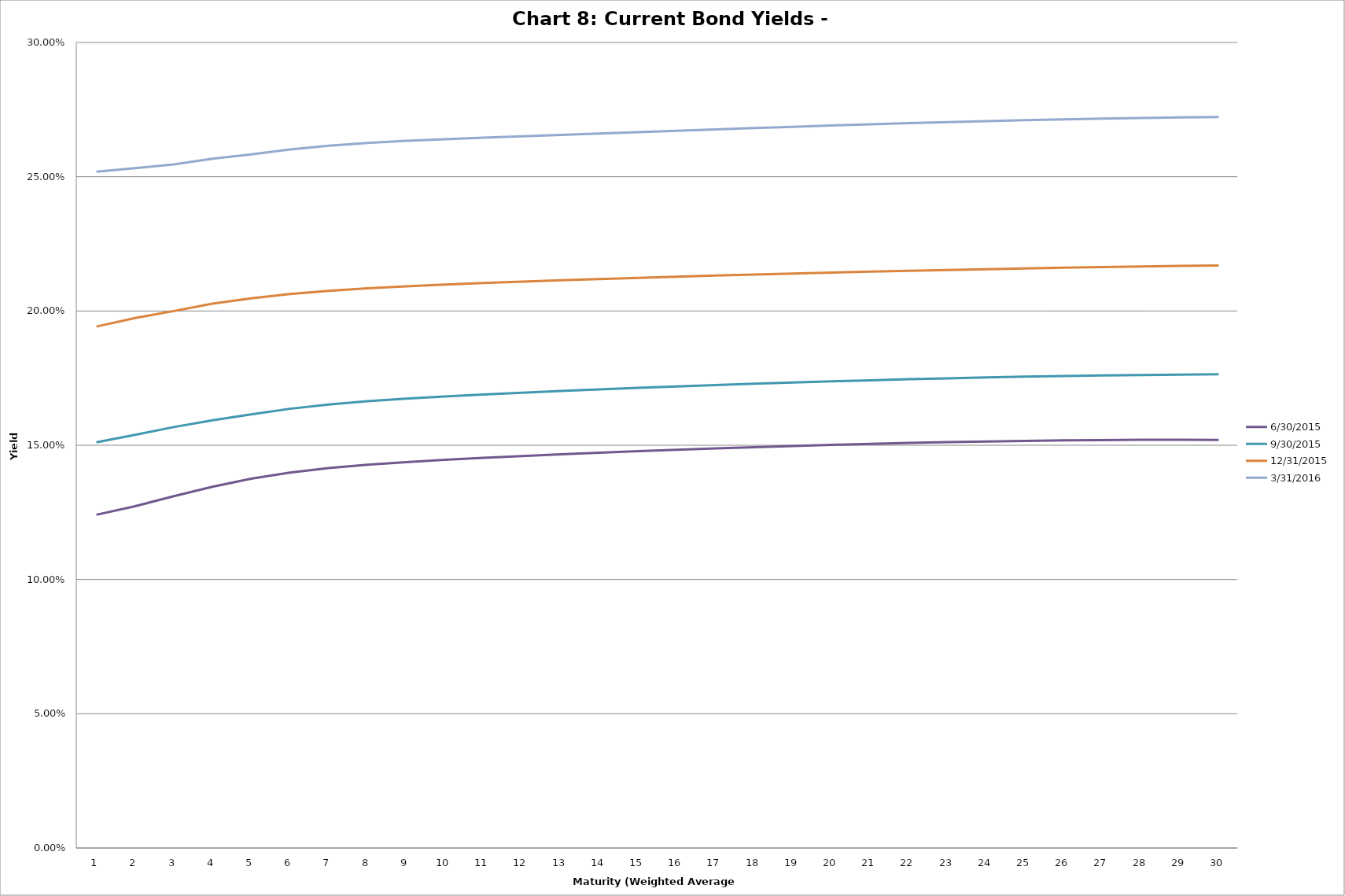
| Category | 6/30/2015 | 9/30/2015 | 12/31/2015 | 3/31/2016 |
|---|---|---|---|---|
| 0 | 0.124 | 0.151 | 0.194 | 0.252 |
| 1 | 0.127 | 0.154 | 0.197 | 0.253 |
| 2 | 0.131 | 0.157 | 0.2 | 0.255 |
| 3 | 0.135 | 0.159 | 0.203 | 0.257 |
| 4 | 0.138 | 0.162 | 0.205 | 0.258 |
| 5 | 0.14 | 0.164 | 0.206 | 0.26 |
| 6 | 0.141 | 0.165 | 0.208 | 0.262 |
| 7 | 0.143 | 0.166 | 0.208 | 0.263 |
| 8 | 0.144 | 0.167 | 0.209 | 0.263 |
| 9 | 0.145 | 0.168 | 0.21 | 0.264 |
| 10 | 0.145 | 0.169 | 0.21 | 0.265 |
| 11 | 0.146 | 0.17 | 0.211 | 0.265 |
| 12 | 0.147 | 0.17 | 0.211 | 0.266 |
| 13 | 0.147 | 0.171 | 0.212 | 0.266 |
| 14 | 0.148 | 0.171 | 0.212 | 0.267 |
| 15 | 0.148 | 0.172 | 0.213 | 0.267 |
| 16 | 0.149 | 0.172 | 0.213 | 0.268 |
| 17 | 0.149 | 0.173 | 0.214 | 0.268 |
| 18 | 0.15 | 0.173 | 0.214 | 0.269 |
| 19 | 0.15 | 0.174 | 0.214 | 0.269 |
| 20 | 0.151 | 0.174 | 0.215 | 0.27 |
| 21 | 0.151 | 0.175 | 0.215 | 0.27 |
| 22 | 0.151 | 0.175 | 0.215 | 0.27 |
| 23 | 0.151 | 0.175 | 0.216 | 0.271 |
| 24 | 0.152 | 0.176 | 0.216 | 0.271 |
| 25 | 0.152 | 0.176 | 0.216 | 0.271 |
| 26 | 0.152 | 0.176 | 0.216 | 0.272 |
| 27 | 0.152 | 0.176 | 0.217 | 0.272 |
| 28 | 0.152 | 0.176 | 0.217 | 0.272 |
| 29 | 0.152 | 0.176 | 0.217 | 0.272 |